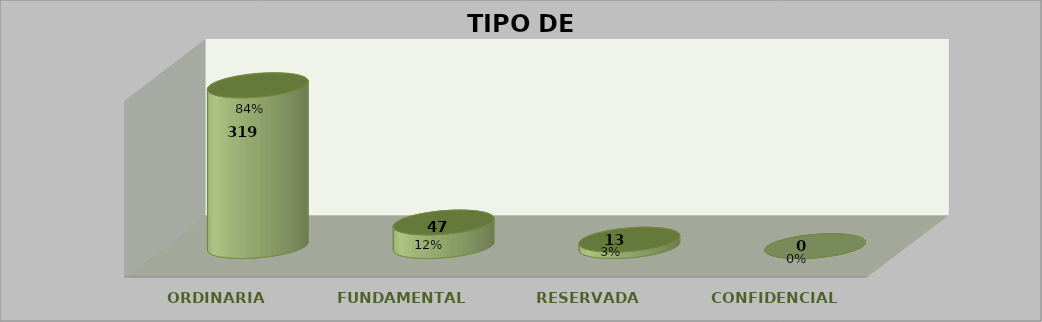
| Category | Series 0 | Series 2 | Series 1 | Series 3 |
|---|---|---|---|---|
| ORDINARIA |  | 319 |  | 0.842 |
| FUNDAMENTAL |  | 47 |  | 0.124 |
| RESERVADA |  | 13 |  | 0.034 |
| CONFIDENCIAL |  | 0 |  | 0 |